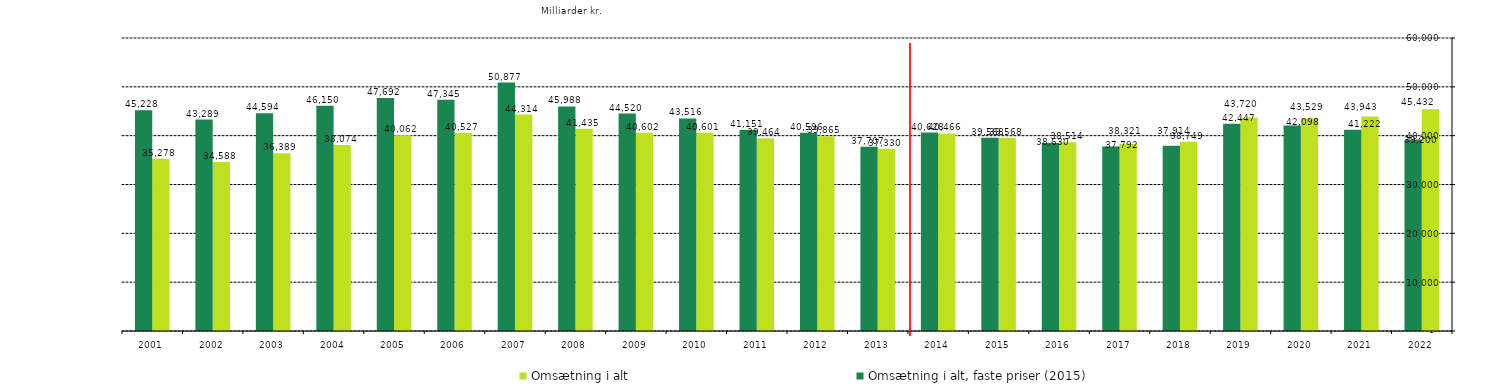
| Category | Omsætning i alt | Omsætning i alt, faste priser (2015) |
|---|---|---|
| 2022.0 | 45432.301 | 39199.569 |
| 2021.0 | 43942.729 | 41222.073 |
| 2020.0 | 43529.136 | 42097.811 |
| 2019.0 | 43720.193 | 42446.789 |
| 2018.0 | 38748.559 | 37914.441 |
| 2017.0 | 38320.677 | 37791.595 |
| 2016.0 | 38630.023 | 38514.48 |
| 2015.0 | 39568.469 | 39568.469 |
| 2014.0 | 40465.647 | 40628.16 |
| 2013.0 | 37330.068 | 37707.139 |
| 2012.0 | 39864.928 | 40595.65 |
| 2011.0 | 39464.007 | 41151.206 |
| 2010.0 | 40600.517 | 43516.095 |
| 2009.0 | 40601.91 | 44519.638 |
| 2008.0 | 41434.892 | 45987.672 |
| 2007.0 | 44313.991 | 50877.142 |
| 2006.0 | 40527.202 | 47344.862 |
| 2005.0 | 40061.522 | 47692.288 |
| 2004.0 | 38073.875 | 46150.151 |
| 2003.0 | 36389.021 | 44594.388 |
| 2002.0 | 34587.914 | 43289.004 |
| 2001.0 | 35277.741 | 45227.873 |